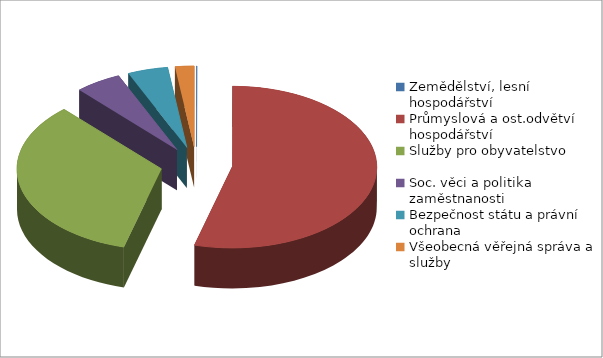
| Category | Series 0 |
|---|---|
| Zemědělství, lesní hospodářství | 384 |
| Průmyslová a ost.odvětví hospodářství | 601606 |
| Služby pro obyvatelstvo | 377935 |
| Soc. věci a politika zaměstnanosti | 57450 |
| Bezpečnost státu a právní ochrana | 49890 |
| Všeobecná věřejná správa a služby | 23598 |